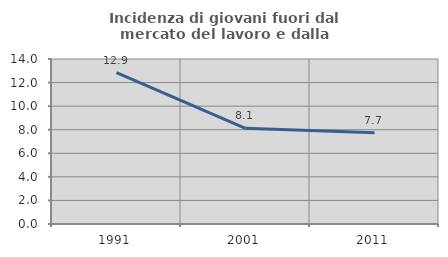
| Category | Incidenza di giovani fuori dal mercato del lavoro e dalla formazione  |
|---|---|
| 1991.0 | 12.852 |
| 2001.0 | 8.115 |
| 2011.0 | 7.745 |